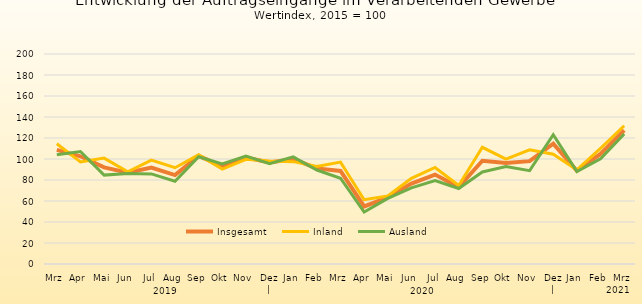
| Category | Insgesamt | Inland | Ausland |
|---|---|---|---|
| Mrz | 108.755 | 114.528 | 103.947 |
| Apr | 102.598 | 97.166 | 107.123 |
| Mai | 92.021 | 100.862 | 84.655 |
| Jun | 86.98 | 87.839 | 86.265 |
| Jul | 91.766 | 98.935 | 85.794 |
| Aug | 84.671 | 91.717 | 78.802 |
| Sep | 102.93 | 103.956 | 102.075 |
| Okt | 93.026 | 90.372 | 95.237 |
| Nov | 101.384 | 99.696 | 102.79 |
| Dez | | 96.68 | 98.084 | 95.511 |
| Jan | 99.927 | 97.474 | 101.969 |
| Feb | 91.073 | 92.941 | 89.516 |
| Mrz | 88.659 | 97.022 | 81.692 |
| Apr | 54.797 | 61.217 | 49.449 |
| Mai | 63.501 | 64.799 | 62.421 |
| Jun | 76.618 | 81.619 | 72.452 |
| Jul | 85.149 | 91.955 | 79.479 |
| Aug | 73.202 | 74.782 | 71.886 |
| Sep | 98.332 | 111.146 | 87.659 |
| Okt | 96.082 | 99.932 | 92.875 |
| Nov | 97.96 | 108.787 | 88.94 |
| Dez | | 114.67 | 104.588 | 123.069 |
| Jan | 88.7 | 89.6 | 88 |
| Feb | 104.8 | 110.2 | 100.2 |
| Mrz | 127.4 | 131.7 | 123.8 |